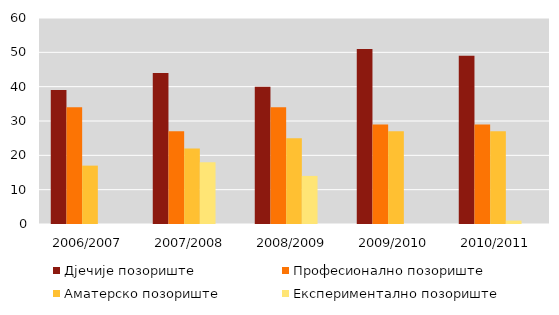
| Category | Дјечије позориште | Професионално позориште | Аматерско позориште | Експериментално позориште | Series 4 |
|---|---|---|---|---|---|
| 2006/2007 | 39 | 34 | 17 | 0 |  |
| 2007/2008 | 44 | 27 | 22 | 18 |  |
| 2008/2009 | 40 | 34 | 25 | 14 |  |
| 2009/2010 | 51 | 29 | 27 | 0 |  |
| 2010/2011 | 49 | 29 | 27 | 1 |  |